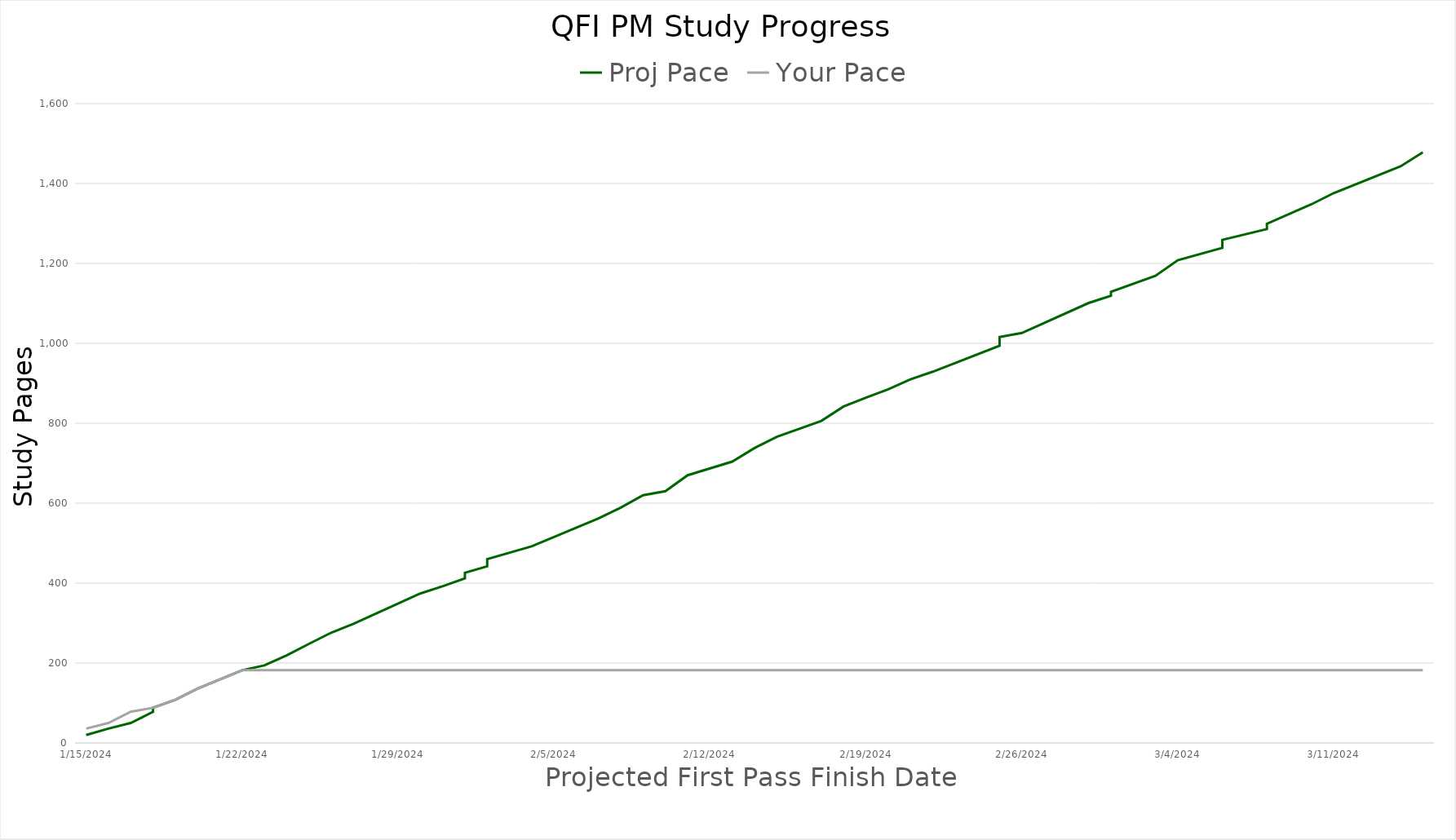
| Category | Proj Pace | Your Pace |
|---|---|---|
| 1/15/24 | 20 | 36 |
| 1/16/24 | 36 | 50 |
| 1/17/24 | 50 | 78 |
| 1/18/24 | 78 | 88 |
| 1/18/24 | 88 | 88 |
| 1/19/24 | 108 | 108 |
| 1/20/24 | 136 | 136 |
| 1/22/24 | 182 | 182 |
| 1/23/24 | 194 | 182 |
| 1/24/24 | 219 | 182 |
| 1/25/24 | 248 | 182 |
| 1/26/24 | 276 | 182 |
| 1/27/24 | 298 | 182 |
| 1/30/24 | 374 | 182 |
| 1/30/24 | 374 | 182 |
| 1/31/24 | 392 | 182 |
| 2/1/24 | 412 | 182 |
| 2/1/24 | 426 | 182 |
| 2/2/24 | 442 | 182 |
| 2/2/24 | 460 | 182 |
| 2/4/24 | 492 | 182 |
| 2/4/24 | 492 | 182 |
| 2/7/24 | 562 | 182 |
| 2/8/24 | 589 | 182 |
| 2/9/24 | 620 | 182 |
| 2/10/24 | 630 | 182 |
| 2/11/24 | 670 | 182 |
| 2/13/24 | 704 | 182 |
| 2/14/24 | 738 | 182 |
| 2/15/24 | 766 | 182 |
| 2/17/24 | 806 | 182 |
| 2/18/24 | 842 | 182 |
| 2/19/24 | 864 | 182 |
| 2/20/24 | 885 | 182 |
| 2/21/24 | 910 | 182 |
| 2/21/24 | 910 | 182 |
| 2/22/24 | 929 | 182 |
| 2/25/24 | 994 | 182 |
| 2/25/24 | 1016 | 182 |
| 2/26/24 | 1026 | 182 |
| 2/26/24 | 1026 | 182 |
| 2/29/24 | 1101 | 182 |
| 3/1/24 | 1119 | 182 |
| 3/1/24 | 1129 | 182 |
| 3/1/24 | 1129 | 182 |
| 3/3/24 | 1169 | 182 |
| 3/4/24 | 1208 | 182 |
| 3/6/24 | 1239 | 182 |
| 3/6/24 | 1259 | 182 |
| 3/8/24 | 1286 | 182 |
| 3/8/24 | 1299 | 182 |
| 3/10/24 | 1348 | 182 |
| 3/11/24 | 1376 | 182 |
| 3/11/24 | 1376 | 182 |
| 3/14/24 | 1443 | 182 |
| 3/16/24 | 1478 | 182 |
| 3/16/24 | 1478 | 182 |